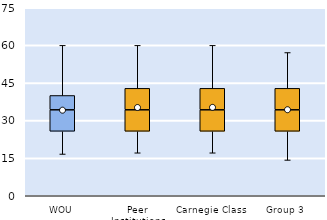
| Category | 25th | 50th | 75th |
|---|---|---|---|
| WOU | 25.714 | 8.571 | 5.714 |
| Peer Institutions | 25.714 | 8.571 | 8.571 |
| Carnegie Class | 25.714 | 8.571 | 8.571 |
| Group 3 | 25.714 | 8.571 | 8.571 |